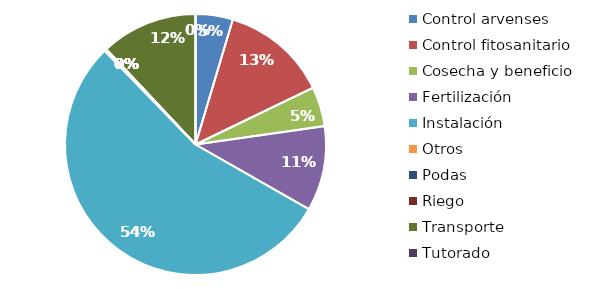
| Category | Valor |
|---|---|
| Control arvenses | 523542 |
| Control fitosanitario | 1498933 |
| Cosecha y beneficio | 556064.456 |
| Fertilización | 1192122 |
| Instalación | 6178493.957 |
| Otros | 30892 |
| Podas | 0 |
| Riego | 0 |
| Transporte | 1359268 |
| Tutorado | 0 |